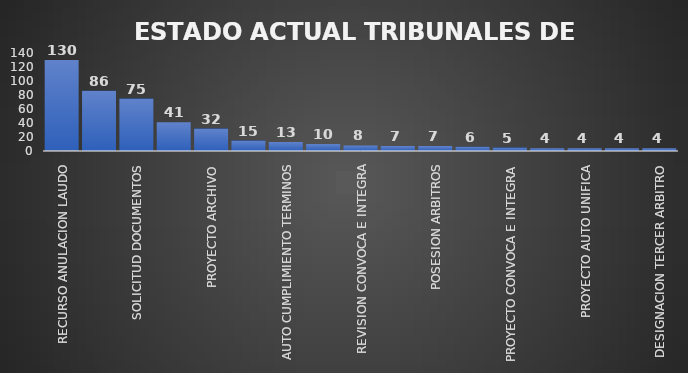
| Category | CANTIDAD | % |
|---|---|---|
| RECURSO ANULACION LAUDO | 130 | 0.284 |
| ESPERA DE LAUDO | 86 | 0.155 |
| SOLICITUD DOCUMENTOS | 75 | 0.158 |
| PAGO HONORARIOS | 41 | 0.082 |
| PROYECTO ARCHIVO | 32 | 0.076 |
| ESTUDIO DOCUMENTOS | 15 | 0.035 |
| AUTO CUMPLIMIENTO TERMINOS | 13 | 0.032 |
| CONSTANCIA | 10 | 0.023 |
| REVISION CONVOCA E INTEGRA | 8 | 0.015 |
| INVESTIGACIÓN ADTIVA LABORAL | 7 | 0.014 |
| POSESION ARBITROS | 7 | 0.016 |
| ARCHIVADO | 6 | 0.014 |
| PROYECTO CONVOCA E INTEGRA | 5 | 0.015 |
| SORTEO ARBITRO | 4 | 0.009 |
| PROYECTO AUTO UNIFICA | 4 | 0.003 |
| DESIGNACION ARBITRO | 4 | 0.012 |
| DESIGNACION TERCER ARBITRO | 4 | 0.013 |